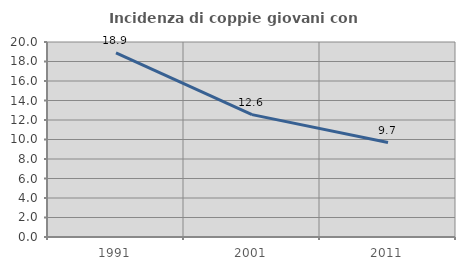
| Category | Incidenza di coppie giovani con figli |
|---|---|
| 1991.0 | 18.875 |
| 2001.0 | 12.554 |
| 2011.0 | 9.688 |